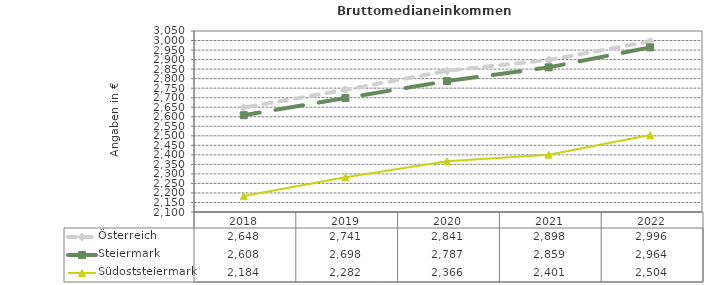
| Category | Österreich | Steiermark | Südoststeiermark |
|---|---|---|---|
| 2022.0 | 2996 | 2964 | 2504 |
| 2021.0 | 2898 | 2859 | 2401 |
| 2020.0 | 2841 | 2787 | 2366 |
| 2019.0 | 2741 | 2698 | 2282 |
| 2018.0 | 2648 | 2608 | 2184 |